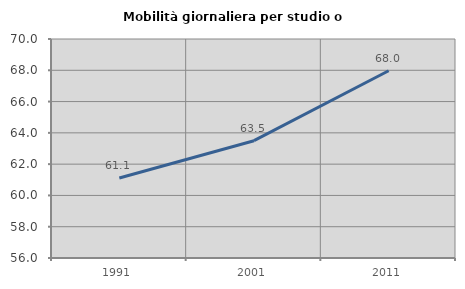
| Category | Mobilità giornaliera per studio o lavoro |
|---|---|
| 1991.0 | 61.111 |
| 2001.0 | 63.499 |
| 2011.0 | 67.968 |